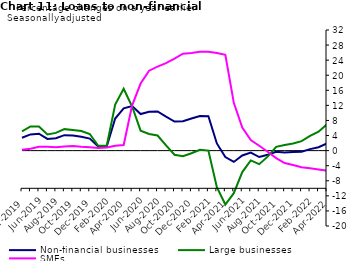
| Category | zero | Non-financial businesses | Large businesses | SMEs |
|---|---|---|---|---|
| Apr-2019 | 0 | 3.4 | 5.1 | 0.2 |
| May-2019 | 0 | 4.3 | 6.4 | 0.5 |
| Jun-2019 | 0 | 4.5 | 6.4 | 1 |
| Jul-2019 | 0 | 3.1 | 4.3 | 1 |
| Aug-2019 | 0 | 3.3 | 4.7 | 0.9 |
| Sep-2019 | 0 | 4.1 | 5.7 | 1.1 |
| Oct-2019 | 0 | 4 | 5.5 | 1.2 |
| Nov-2019 | 0 | 3.7 | 5.2 | 1 |
| Dec-2019 | 0 | 3.2 | 4.4 | 0.9 |
| Jan-2020 | 0 | 1.1 | 1.3 | 0.7 |
| Feb-2020 | 0 | 1.1 | 1.3 | 0.8 |
| Mar-2020 | 0 | 8.5 | 12.2 | 1.3 |
| Apr-2020 | 0 | 11.2 | 16.4 | 1.5 |
| May-2020 | 0 | 11.8 | 11.7 | 12 |
| Jun-2020 | 0 | 9.7 | 5.3 | 17.8 |
| Jul-2020 | 0 | 10.3 | 4.4 | 21.2 |
| Aug-2020 | 0 | 10.4 | 4 | 22.3 |
| Sep-2020 | 0 | 9 | 1.4 | 23.2 |
| Oct-2020 | 0 | 7.7 | -1.1 | 24.4 |
| Nov-2020 | 0 | 7.8 | -1.5 | 25.7 |
| Dec-2020 | 0 | 8.5 | -0.7 | 25.9 |
| Jan-2021 | 0 | 9.2 | 0.2 | 26.2 |
| Feb-2021 | 0 | 9.1 | 0 | 26.2 |
| Mar-2021 | 0 | 1.9 | -9.7 | 25.9 |
| Apr-2021 | 0 | -1.7 | -14.3 | 25.4 |
| May-2021 | 0 | -3 | -11.3 | 12.7 |
| Jun-2021 | 0 | -1.3 | -5.7 | 6.1 |
| Jul-2021 | 0 | -0.5 | -2.6 | 2.8 |
| Aug-2021 | 0 | -1.7 | -3.6 | 1.3 |
| Sep-2021 | 0 | -1.1 | -1.6 | -0.3 |
| Oct-2021 | 0 | -0.3 | 1 | -2 |
| Nov-2021 | 0 | -0.5 | 1.5 | -3.3 |
| Dec-2021 | 0 | -0.4 | 1.9 | -3.8 |
| Jan-2022 | 0 | -0.3 | 2.5 | -4.4 |
| Feb-2022 | 0 | 0.4 | 3.9 | -4.7 |
| Mar-2022 | 0 | 0.9 | 5 | -5 |
| Apr-2022 | 0 | 1.9 | 7 | -5.3 |